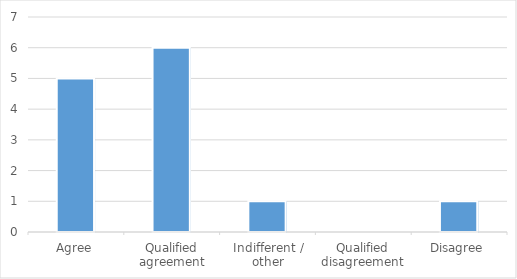
| Category | Series 0 |
|---|---|
| Agree | 5 |
| Qualified agreement | 6 |
| Indifferent / other | 1 |
| Qualified disagreement | 0 |
| Disagree | 1 |